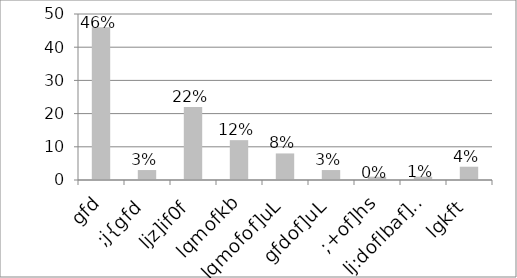
| Category | Series 0 |
|---|---|
| gfd | 46 |
| ;j{gfd | 3 |
| ljz]if0f | 22 |
| lqmofkb | 12 |
| lqmofof]uL | 8 |
| gfdof]uL | 3 |
| ;+of]hs | 1 |
| lj:doflbaf]ws | 1 |
| lgkft | 4 |